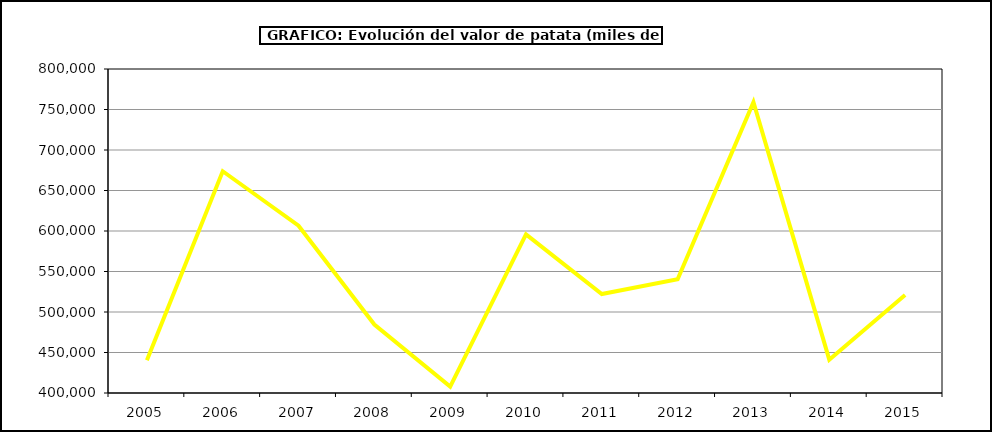
| Category | Valor |
|---|---|
| 2005.0 | 440403.115 |
| 2006.0 | 673768.768 |
| 2007.0 | 606505.757 |
| 2008.0 | 484594.129 |
| 2009.0 | 407893.65 |
| 2010.0 | 595780.386 |
| 2011.0 | 522199.983 |
| 2012.0 | 540398.006 |
| 2013.0 | 759146.328 |
| 2014.0 | 441131.161 |
| 2015.0 | 520997 |